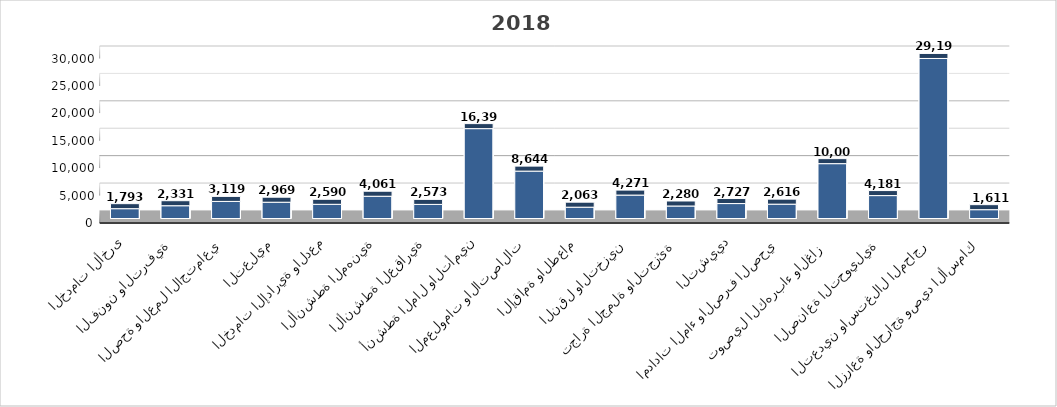
| Category | متوسط التعويضات  |
|---|---|
| الزراعة والحراجة وصيد الأسماك | 1611 |
| التعدين واستغلال المحاجر | 29194 |
| الصناعة التحويلية | 4181 |
| توصيل الكهرباء والغاز  | 10007 |
| امدادات الماء والصرف الصحي | 2616 |
| التشييد | 2727 |
| تجارة الجملة والتجزئة | 2280 |
| النقل والتخزين | 4271 |
| الإقامة والطعام | 2063 |
| المعلومات والاتصالات | 8644 |
| أنشطة المال والتأمين | 16395 |
| الأنشطة العقارية | 2573 |
| الأنشطة المهنية  | 4061 |
| الخدمات الإدارية والدعم | 2590 |
| التعليم | 2969 |
| الصحة والعمل الاجتماعي | 3119 |
| الفنون والترفية | 2331 |
| الخدمات الأخرى | 1793 |